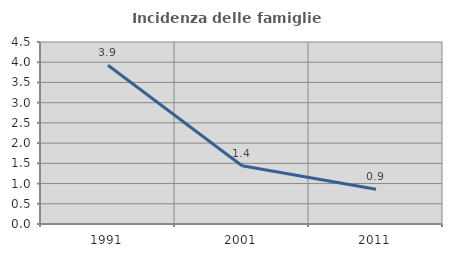
| Category | Incidenza delle famiglie numerose |
|---|---|
| 1991.0 | 3.924 |
| 2001.0 | 1.44 |
| 2011.0 | 0.859 |